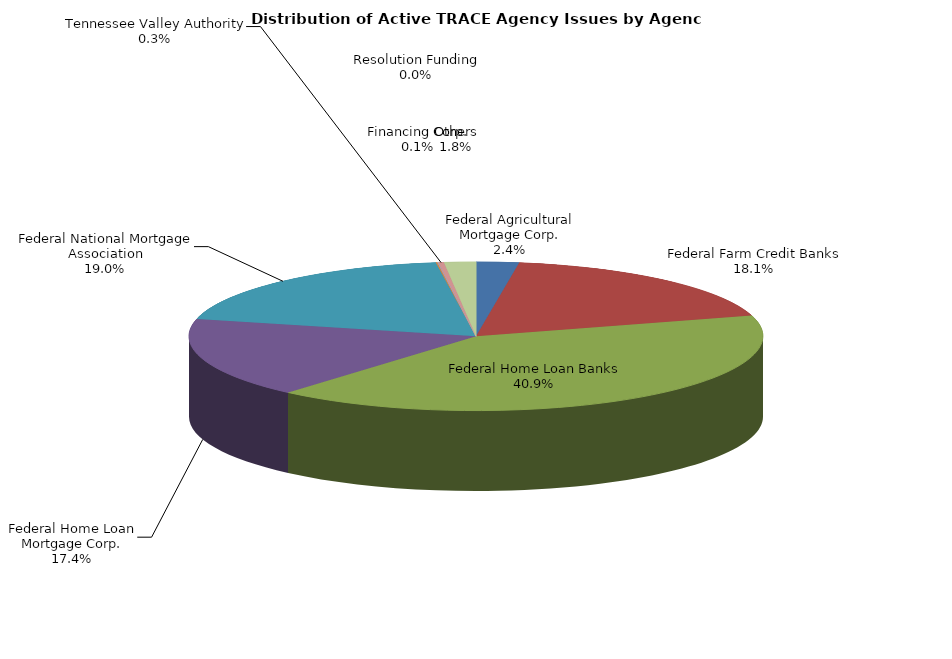
| Category | Series 0 |
|---|---|
| Federal Agricultural Mortgage Corp. | 376 |
| Federal Farm Credit Banks | 2833 |
| Federal Home Loan Banks | 6394 |
| Federal Home Loan Mortgage Corp. | 2723 |
| Federal National Mortgage Association | 2976 |
| Financing Corp. | 14 |
| Resolution Funding | 6 |
| Tennessee Valley Authority | 50 |
| Others | 279 |